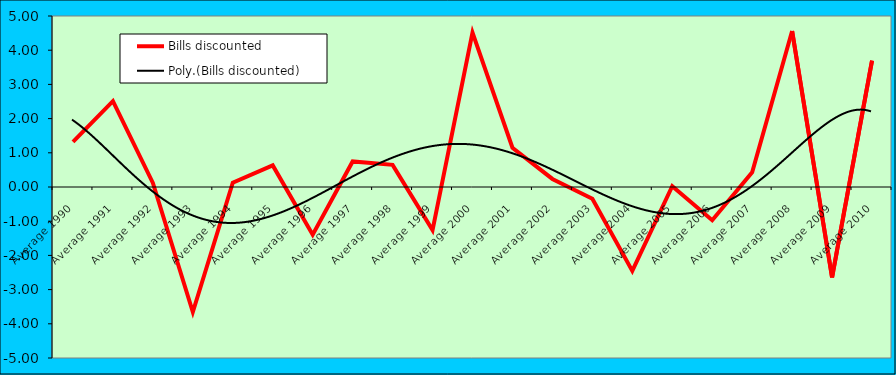
| Category | Bills discounted |
|---|---|
| Average 1990 | 1.317 |
| Average 1991 | 2.509 |
| Average 1992 | 0.118 |
| Average 1993 | -3.657 |
| Average 1994 | 0.125 |
| Average 1995 | 0.632 |
| Average 1996 | -1.397 |
| Average 1997 | 0.747 |
| Average 1998 | 0.647 |
| Average 1999 | -1.26 |
| Average 2000 | 4.514 |
| Average 2001 | 1.148 |
| Average 2002 | 0.236 |
| Average 2003 | -0.341 |
| Average 2004 | -2.452 |
| Average 2005 | 0.023 |
| Average 2006 | -0.971 |
| Average 2007 | 0.427 |
| Average 2008 | 4.562 |
| Average 2009 | -2.646 |
| Average 2010 | 3.696 |